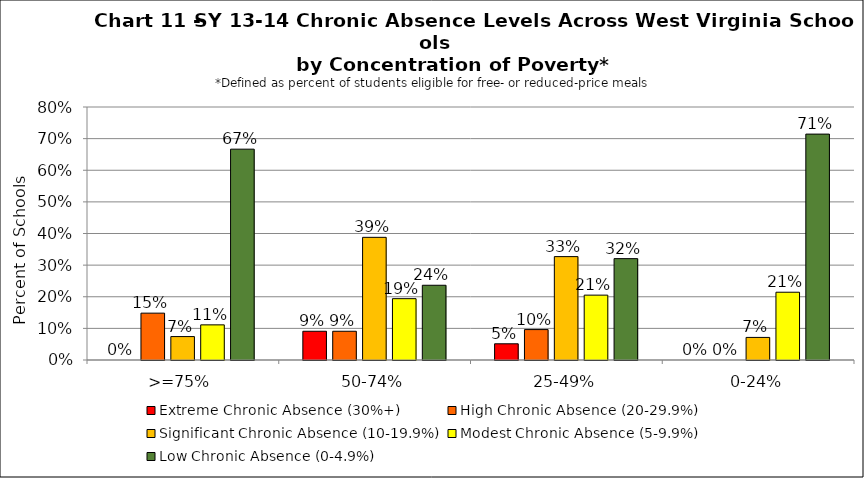
| Category | Extreme Chronic Absence (30%+) | High Chronic Absence (20-29.9%) | Significant Chronic Absence (10-19.9%) | Modest Chronic Absence (5-9.9%) | Low Chronic Absence (0-4.9%) |
|---|---|---|---|---|---|
| 0 | 0 | 0.148 | 0.074 | 0.111 | 0.667 |
| 1 | 0.091 | 0.091 | 0.388 | 0.194 | 0.236 |
| 2 | 0.051 | 0.096 | 0.327 | 0.205 | 0.321 |
| 3 | 0 | 0 | 0.071 | 0.214 | 0.714 |